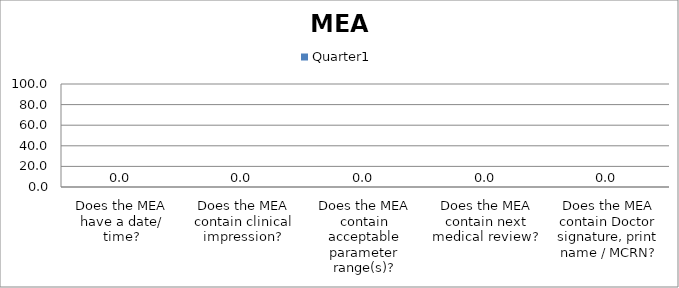
| Category | Quarter1 |
|---|---|
| Does the MEA have a date/ time? | 0 |
| Does the MEA contain clinical impression? | 0 |
| Does the MEA contain acceptable parameter range(s)? | 0 |
| Does the MEA contain next medical review? | 0 |
| Does the MEA contain Doctor signature, print name / MCRN? | 0 |